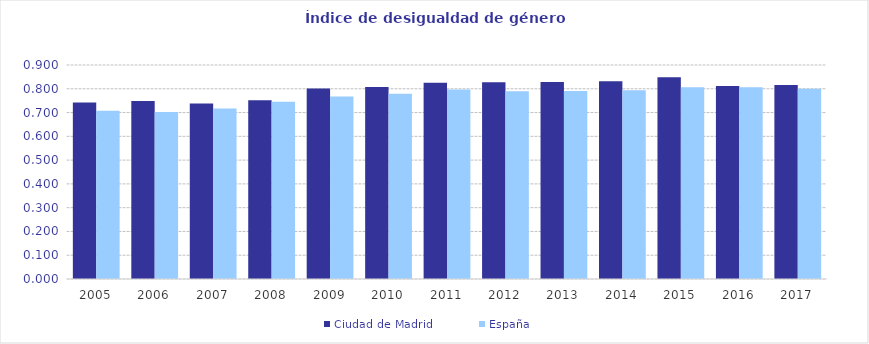
| Category | Ciudad de Madrid | España |
|---|---|---|
| 2005.0 | 0.742 | 0.707 |
| 2006.0 | 0.749 | 0.702 |
| 2007.0 | 0.738 | 0.717 |
| 2008.0 | 0.752 | 0.745 |
| 2009.0 | 0.802 | 0.768 |
| 2010.0 | 0.807 | 0.779 |
| 2011.0 | 0.826 | 0.797 |
| 2012.0 | 0.828 | 0.79 |
| 2013.0 | 0.829 | 0.791 |
| 2014.0 | 0.832 | 0.794 |
| 2015.0 | 0.849 | 0.806 |
| 2016.0 | 0.812 | 0.806 |
| 2017.0 | 0.816 | 0.8 |